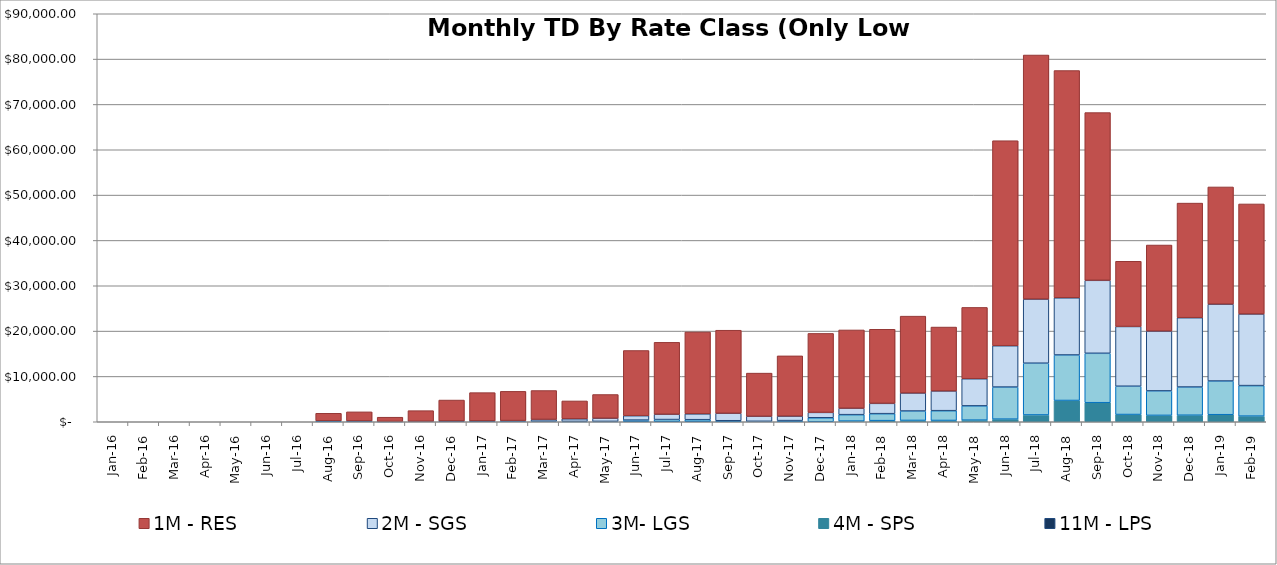
| Category | 11M - LPS | 4M - SPS | 3M- LGS | 2M - SGS | 1M - RES |
|---|---|---|---|---|---|
| 2016-01-01 | 0 | 0 | 0 | 0 | 0 |
| 2016-02-01 | 0 | 0 | 0 | 0 | 0 |
| 2016-03-01 | 0 | 0 | 0 | 0 | 0 |
| 2016-04-01 | 0 | 0 | 0 | 0 | 0 |
| 2016-05-01 | 0 | 0 | 0 | 0 | 0 |
| 2016-06-01 | 0 | 0 | 0 | 0 | 0 |
| 2016-07-01 | 0 | 0 | 0 | 0 | 0 |
| 2016-08-01 | 0 | 0 | 203.97 | 0 | 1664.88 |
| 2016-09-01 | 0 | 0 | 179.03 | 0 | 2005.41 |
| 2016-10-01 | 0 | 0 | 62.44 | 0 | 943.49 |
| 2016-11-01 | 0 | 0 | 103.13 | 0 | 2346.52 |
| 2016-12-01 | 0 | 0 | 164.69 | 15.52 | 4608.26 |
| 2017-01-01 | 0 | 0 | 164.68 | 32.31 | 6228.58 |
| 2017-02-01 | 0 | 0 | 141.45 | 120.93 | 6446.1 |
| 2017-03-01 | 0 | 0 | 113.7 | 403.31 | 6369.66 |
| 2017-04-01 | 0 | 0 | 71.9 | 576.53 | 3944.71 |
| 2017-05-01 | 0 | 0 | 79.28 | 708.46 | 5220.13 |
| 2017-06-01 | 0 | 0 | 365.4 | 973.31 | 14379.04 |
| 2017-07-01 | 0 | 0 | 484.04 | 1177.35 | 15860.84 |
| 2017-08-01 | 0 | 0 | 454.19 | 1291.35 | 18058.71 |
| 2017-09-01 | 0 | 0 | 223.43 | 1653.4 | 18317.01 |
| 2017-10-01 | 0 | 0 | 97.2 | 1113.88 | 9520.75 |
| 2017-11-01 | 0 | 0 | 253.64 | 993.77 | 13284.36 |
| 2017-12-01 | 0 | 0 | 881.63 | 1184.77 | 17422.24 |
| 2018-01-01 | 0 | 140.56 | 1421.57 | 1430.58 | 17258.07 |
| 2018-02-01 | 0 | 242.38 | 1540.37 | 2277.85 | 16341.02 |
| 2018-03-01 | 0 | 291.86 | 2081.55 | 3971.62 | 16954.37 |
| 2018-04-01 | 0 | 282.46 | 2160.5 | 4357.29 | 14093.07 |
| 2018-05-01 | 0 | 354.48 | 3152.47 | 5983.26 | 15734.03 |
| 2018-06-01 | 0 | 572.9 | 7081.06 | 9118.59 | 45226.22 |
| 2018-07-01 | 0 | 1502.01 | 11414.27 | 14150.49 | 53833.57 |
| 2018-08-01 | 0 | 4690.21 | 10041.51 | 12611.73 | 50127.9 |
| 2018-09-01 | 0 | 4199.54 | 10902.47 | 16099.91 | 36997.13 |
| 2018-10-01 | 0 | 1594.02 | 6241.19 | 13186.14 | 14382.98 |
| 2018-11-01 | 0 | 1403.96 | 5404.62 | 13198.27 | 18979.53 |
| 2018-12-01 | 0 | 1437.6 | 6226.74 | 15289.13 | 25279.9 |
| 2019-01-01 | 0 | 1552.86 | 7433.22 | 16963.94 | 25845.75 |
| 2019-02-01 | 0 | 1239.37 | 6735.27 | 15799.71 | 24270.19 |